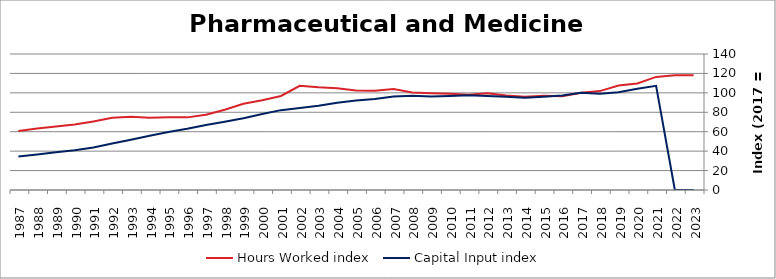
| Category | Hours Worked index | Capital Input index |
|---|---|---|
| 2023.0 | 117.999 | 0 |
| 2022.0 | 118.203 | 0 |
| 2021.0 | 116.428 | 107.208 |
| 2020.0 | 109.594 | 104.285 |
| 2019.0 | 107.614 | 100.527 |
| 2018.0 | 101.826 | 99.173 |
| 2017.0 | 100 | 100 |
| 2016.0 | 96.558 | 97.272 |
| 2015.0 | 97.056 | 96.011 |
| 2014.0 | 96.121 | 94.854 |
| 2013.0 | 97.343 | 95.975 |
| 2012.0 | 99.508 | 96.858 |
| 2011.0 | 97.93 | 97.433 |
| 2010.0 | 99.118 | 96.891 |
| 2009.0 | 99.561 | 96.279 |
| 2008.0 | 100.411 | 97.025 |
| 2007.0 | 104.081 | 96.363 |
| 2006.0 | 102.235 | 93.57 |
| 2005.0 | 102.468 | 92.167 |
| 2004.0 | 104.749 | 89.709 |
| 2003.0 | 105.768 | 86.661 |
| 2002.0 | 107.252 | 84.354 |
| 2001.0 | 96.82 | 82.211 |
| 2000.0 | 92.443 | 78.158 |
| 1999.0 | 88.739 | 73.833 |
| 1998.0 | 82.66 | 70.273 |
| 1997.0 | 77.398 | 66.815 |
| 1996.0 | 74.762 | 63.041 |
| 1995.0 | 74.826 | 59.745 |
| 1994.0 | 74.263 | 55.771 |
| 1993.0 | 75.327 | 51.817 |
| 1992.0 | 74.293 | 47.843 |
| 1991.0 | 70.614 | 43.8 |
| 1990.0 | 67.315 | 40.98 |
| 1989.0 | 65.463 | 38.778 |
| 1988.0 | 63.259 | 36.47 |
| 1987.0 | 60.692 | 34.48 |